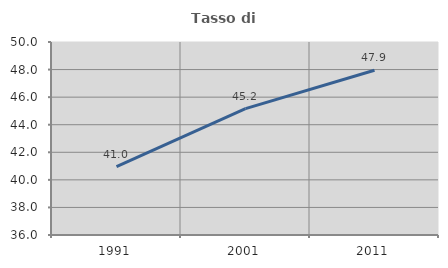
| Category | Tasso di occupazione   |
|---|---|
| 1991.0 | 40.956 |
| 2001.0 | 45.164 |
| 2011.0 | 47.948 |